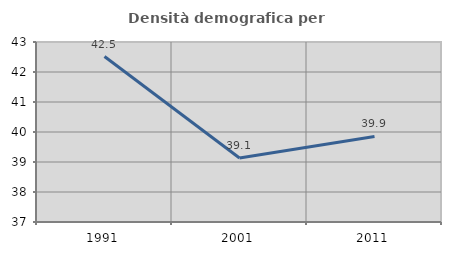
| Category | Densità demografica |
|---|---|
| 1991.0 | 42.515 |
| 2001.0 | 39.134 |
| 2011.0 | 39.853 |